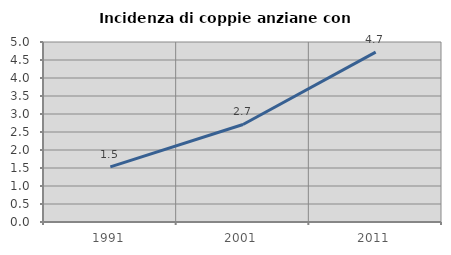
| Category | Incidenza di coppie anziane con figli |
|---|---|
| 1991.0 | 1.533 |
| 2001.0 | 2.709 |
| 2011.0 | 4.719 |